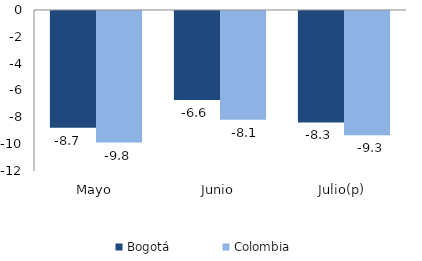
| Category | Bogotá | Colombia |
|---|---|---|
| Mayo | -8.695 | -9.81 |
| Junio | -6.64 | -8.097 |
| Julio(p) | -8.306 | -9.257 |